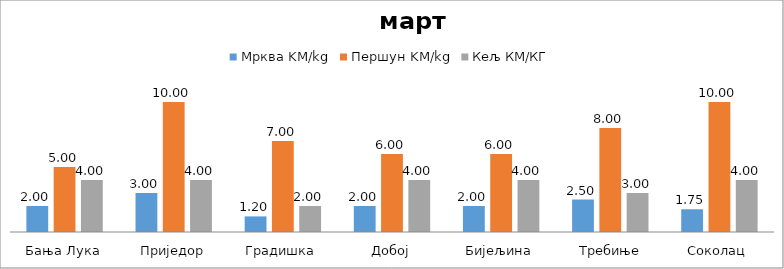
| Category | Мрква | Першун | Кељ |
|---|---|---|---|
| Бања Лука | 2 | 5 | 4 |
| Приједор | 3 | 10 | 4 |
| Градишка | 1.2 | 7 | 2 |
| Добој | 2 | 6 | 4 |
| Бијељина | 2 | 6 | 4 |
|  Требиње | 2.5 | 8 | 3 |
| Соколац | 1.75 | 10 | 4 |